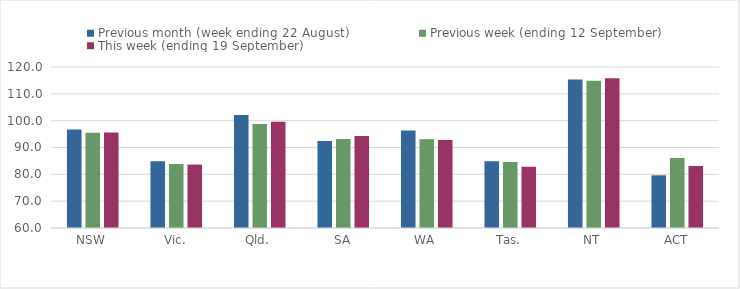
| Category | Previous month (week ending 22 August) | Previous week (ending 12 September) | This week (ending 19 September) |
|---|---|---|---|
| NSW | 96.73 | 95.48 | 95.62 |
| Vic. | 84.92 | 83.85 | 83.64 |
| Qld. | 102.11 | 98.73 | 99.62 |
| SA | 92.46 | 93.18 | 94.31 |
| WA | 96.35 | 93.03 | 92.8 |
| Tas. | 84.89 | 84.59 | 82.82 |
| NT | 115.35 | 114.83 | 115.83 |
| ACT | 79.63 | 86.11 | 83.11 |